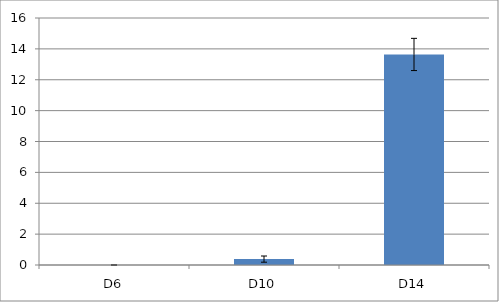
| Category | Series 0 |
|---|---|
| _x0002_D6 | 0 |
| _x0003_D10 | 0.382 |
| _x0003_D14 | 13.638 |